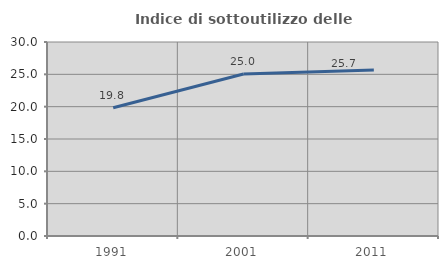
| Category | Indice di sottoutilizzo delle abitazioni  |
|---|---|
| 1991.0 | 19.839 |
| 2001.0 | 25.043 |
| 2011.0 | 25.657 |